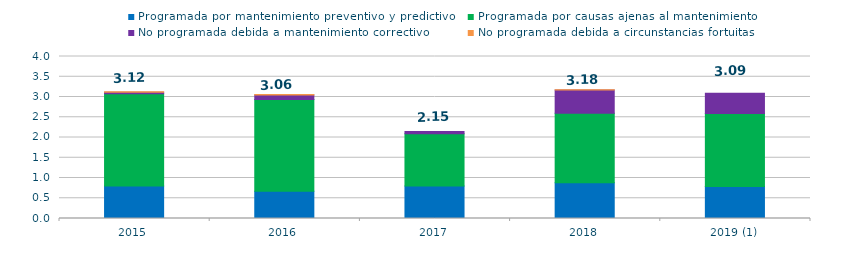
| Category | Programada por mantenimiento preventivo y predictivo | Programada por causas ajenas al mantenimiento  | No programada debida a mantenimiento correctivo  | No programada debida a circunstancias fortuitas  |
|---|---|---|---|---|
| 2015 | 0.8 | 2.28 | 0.04 | 0.01 |
| 2016 | 0.67 | 2.27 | 0.11 | 0.01 |
| 2017 | 0.8 | 1.29 | 0.06 | 0 |
| 2018 | 0.88 | 1.72 | 0.57 | 0.01 |
| 2019 (1) | 0.79 | 1.8 | 0.5 | 0 |